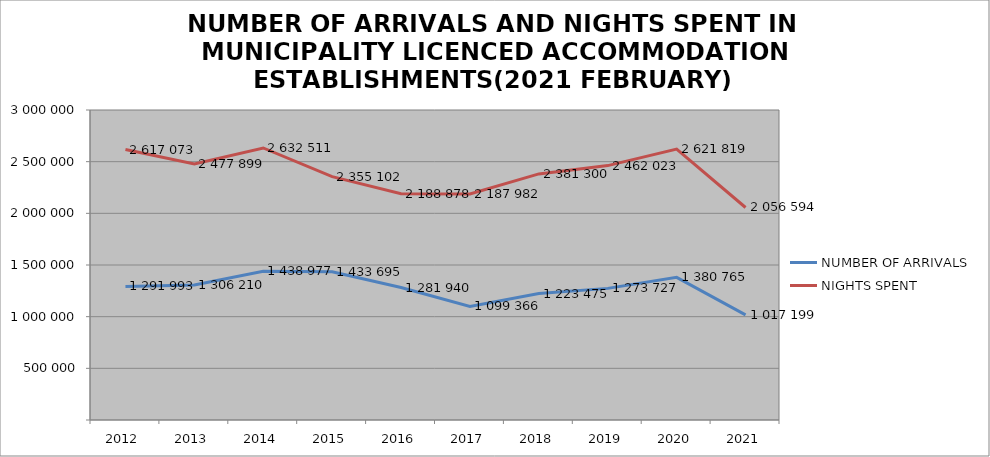
| Category | NUMBER OF ARRIVALS | NIGHTS SPENT |
|---|---|---|
| 2012 | 1291993 | 2617073 |
| 2013 | 1306210 | 2477899 |
| 2014 | 1438977 | 2632511 |
| 2015 | 1433695 | 2355102 |
| 2016 | 1281940 | 2188878 |
| 2017 | 1099366 | 2187982 |
| 2018 | 1223475 | 2381300 |
| 2019 | 1273727 | 2462023 |
| 2020 | 1380765 | 2621819 |
| 2021 | 1017199 | 2056594 |